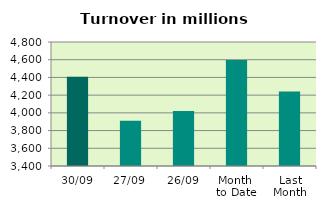
| Category | Series 0 |
|---|---|
| 30/09 | 4407.167 |
| 27/09 | 3910.677 |
| 26/09 | 4020.266 |
| Month 
to Date | 4598.075 |
| Last
Month | 4240.294 |